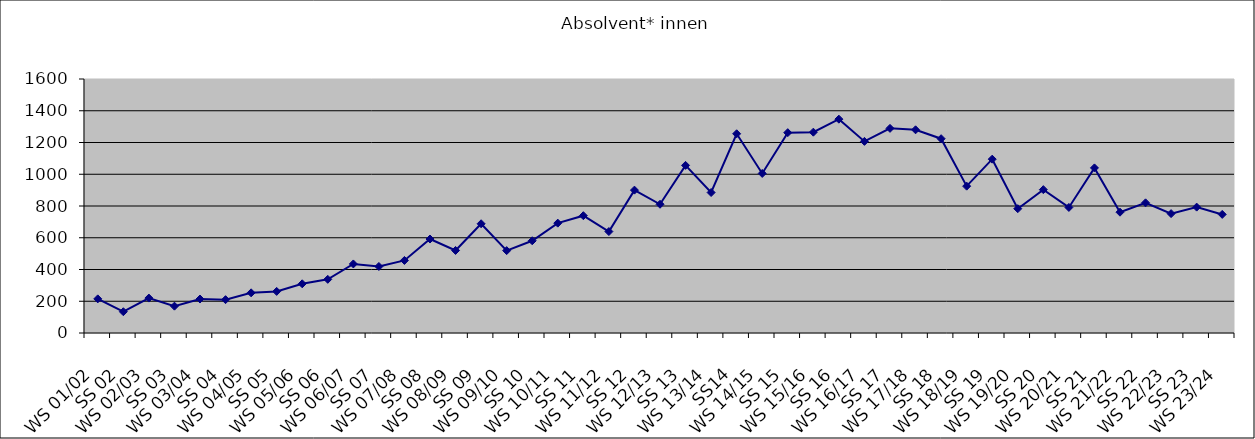
| Category | Absolvent* innen |
|---|---|
| WS 01/02 | 215 |
| SS 02 | 134 |
| WS 02/03 | 220 |
| SS 03 | 169 |
| WS 03/04 | 214 |
| SS 04 | 210 |
| WS 04/05 | 253 |
| SS 05 | 262 |
| WS 05/06 | 310 |
| SS 06 | 338 |
| WS 06/07 | 435 |
| SS 07 | 419 |
| WS 07/08 | 457 |
| SS 08 | 592 |
| WS 08/09 | 520 |
| SS 09 | 688 |
| WS 09/10 | 519 |
| SS 10 | 581 |
| WS 10/11 | 692 |
| SS 11 | 739 |
| WS 11/12 | 639 |
| SS 12 | 900 |
| WS 12/13 | 811 |
| SS 13 | 1056 |
| WS 13/14 | 885 |
| SS14 | 1255 |
| WS 14/15 | 1005 |
| SS 15 | 1262 |
| WS 15/16 | 1265 |
| SS 16 | 1347 |
| WS 16/17 | 1207 |
| SS 17 | 1289 |
| WS 17/18 | 1280 |
| SS 18 | 1224 |
| WS 18/19 | 925 |
| SS 19 | 1095 |
| WS 19/20 | 783 |
| SS 20 | 903 |
| WS 20/21 | 791 |
| SS 21 | 1040 |
| WS 21/22 | 761 |
| SS 22 | 820 |
| WS 22/23 | 752 |
| SS 23 | 793 |
| WS 23/24 | 747 |